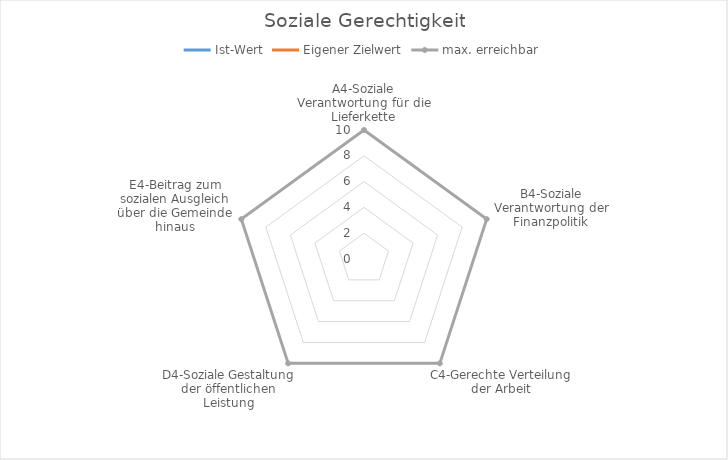
| Category | Ist-Wert | Eigener Zielwert | max. erreichbar |
|---|---|---|---|
| A4-Soziale Verantwortung für die Lieferkette | 0 | 0 | 10 |
| B4-Soziale Verantwortung der Finanzpolitik | 0 | 0 | 10 |
| C4-Gerechte Verteilung der Arbeit | 0 | 0 | 10 |
| D4-Soziale Gestaltung der öffentlichen Leistung | 0 | 0 | 10 |
| E4-Beitrag zum sozialen Ausgleich über die Gemeinde hinaus | 0 | 0 | 10 |